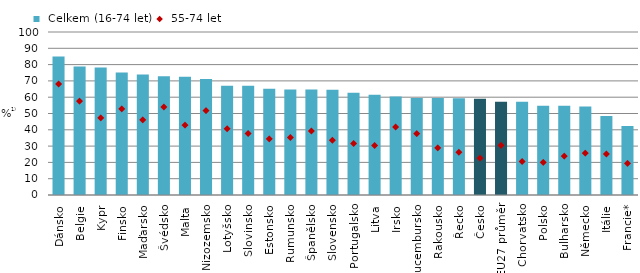
| Category |  Celkem (16-74 let) |
|---|---|
| Dánsko | 85 |
| Belgie | 78.9 |
| Kypr | 78.2 |
| Finsko | 75.1 |
| Maďarsko | 74 |
| Švédsko | 72.9 |
| Malta | 72.5 |
| Nizozemsko | 71.2 |
| Lotyšsko | 67.1 |
| Slovinsko | 67.1 |
| Estonsko | 65.2 |
| Rumunsko | 64.8 |
| Španělsko | 64.7 |
| Slovensko | 64.5 |
| Portugalsko | 62.7 |
| Litva | 61.5 |
| Irsko | 60.5 |
| Lucembursko | 59.5 |
| Rakousko | 59.5 |
| Řecko | 59.4 |
| Česko | 59 |
| EU27 průměr | 57.255 |
| Chorvatsko | 57.2 |
| Polsko | 54.8 |
| Bulharsko | 54.7 |
| Německo | 54.3 |
| Itálie | 48.425 |
| Francie* | 42.324 |